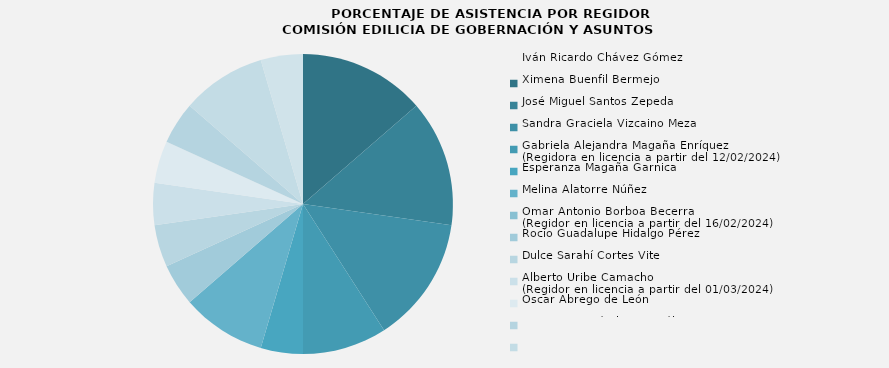
| Category | Iván Ricardo Chávez Gómez  |
|---|---|
| Iván Ricardo Chávez Gómez  | 100 |
| Ximena Buenfil Bermejo | 100 |
| José Miguel Santos Zepeda | 100 |
| Sandra Graciela Vizcaino Meza | 66.667 |
| Gabriela Alejandra Magaña Enríquez
(Regidora en licencia a partir del 12/02/2024) | 33.333 |
| Esperanza Magaña Garnica | 66.667 |
| Melina Alatorre Núñez | 0 |
| Omar Antonio Borboa Becerra
(Regidor en licencia a partir del 16/02/2024) | 33.333 |
| Rocío Guadalupe Hidalgo Pérez | 33.333 |
| Dulce Sarahí Cortes Vite | 33.333 |
| Alberto Uribe Camacho
(Regidor en licencia a partir del 01/03/2024) | 33.333 |
| Oscar Abrego de León | 33.333 |
| Mariana Hernández González
(Regidor en licencia a partir del 01/03/2024) | 66.667 |
| Eloy Francisco Aquino Herrán  | 33.333 |